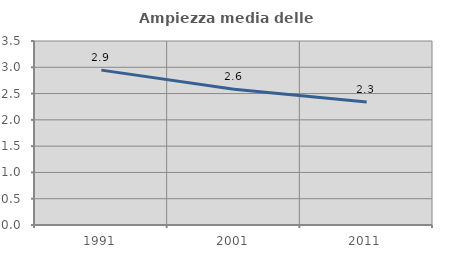
| Category | Ampiezza media delle famiglie |
|---|---|
| 1991.0 | 2.946 |
| 2001.0 | 2.582 |
| 2011.0 | 2.341 |